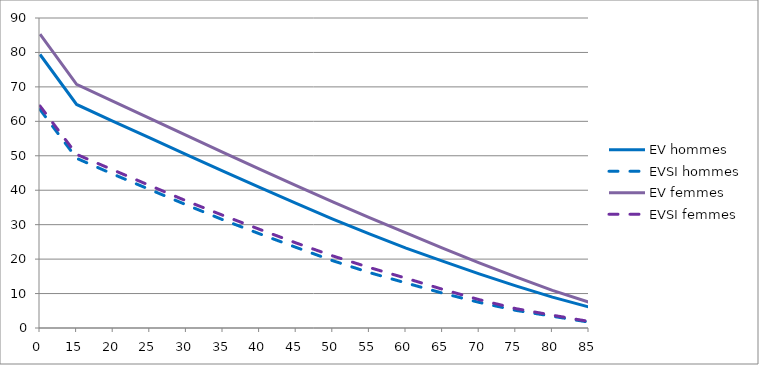
| Category | EV hommes | EVSI hommes | EV femmes | EVSI femmes |
|---|---|---|---|---|
| 0.0 | 79.4 | 63.429 | 85.3 | 64.458 |
| 15.0 | 64.9 | 49.264 | 70.744 | 50.41 |
| 20.0 | 60 | 44.641 | 65.8 | 45.87 |
| 25.0 | 55.172 | 40.203 | 60.849 | 41.366 |
| 30.0 | 50.345 | 35.741 | 55.908 | 36.888 |
| 35.0 | 45.546 | 31.406 | 50.988 | 32.7 |
| 40.0 | 40.8 | 27.341 | 46.1 | 28.641 |
| 45.0 | 36.146 | 23.388 | 41.321 | 24.68 |
| 50.0 | 31.633 | 19.531 | 36.633 | 20.919 |
| 55.0 | 27.296 | 16.094 | 32.052 | 17.564 |
| 60.0 | 23.2 | 13.069 | 27.6 | 14.456 |
| 65.0 | 19.4 | 10.11 | 23.2 | 11.235 |
| 70.0 | 15.707 | 7.437 | 18.931 | 8.235 |
| 75.0 | 12.23 | 5.12 | 14.826 | 5.622 |
| 80.0 | 8.949 | 3.41 | 10.944 | 3.722 |
| 85.0 | 6.083 | 1.697 | 7.495 | 1.909 |